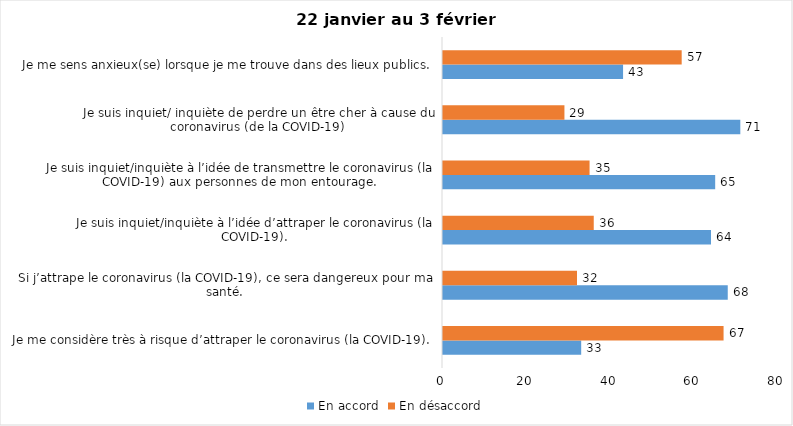
| Category | En accord | En désaccord |
|---|---|---|
| Je me considère très à risque d’attraper le coronavirus (la COVID-19). | 33 | 67 |
| Si j’attrape le coronavirus (la COVID-19), ce sera dangereux pour ma santé. | 68 | 32 |
| Je suis inquiet/inquiète à l’idée d’attraper le coronavirus (la COVID-19). | 64 | 36 |
| Je suis inquiet/inquiète à l’idée de transmettre le coronavirus (la COVID-19) aux personnes de mon entourage. | 65 | 35 |
| Je suis inquiet/ inquiète de perdre un être cher à cause du coronavirus (de la COVID-19) | 71 | 29 |
| Je me sens anxieux(se) lorsque je me trouve dans des lieux publics. | 43 | 57 |